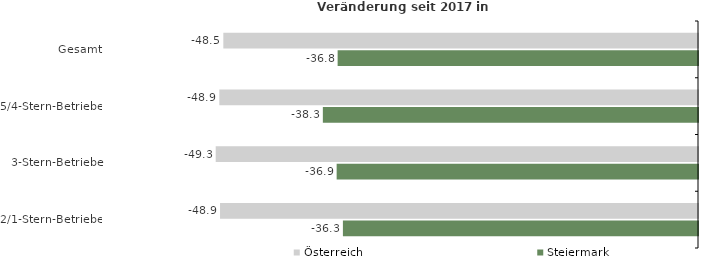
| Category | Österreich | Steiermark |
|---|---|---|
| Gesamt | -48.519 | -36.835 |
| 5/4-Stern-Betriebe | -48.928 | -38.346 |
| 3-Stern-Betriebe | -49.297 | -36.936 |
| 2/1-Stern-Betriebe | -48.857 | -36.296 |